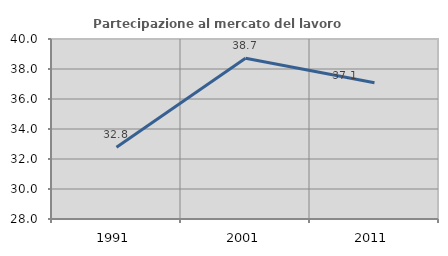
| Category | Partecipazione al mercato del lavoro  femminile |
|---|---|
| 1991.0 | 32.785 |
| 2001.0 | 38.718 |
| 2011.0 | 37.087 |